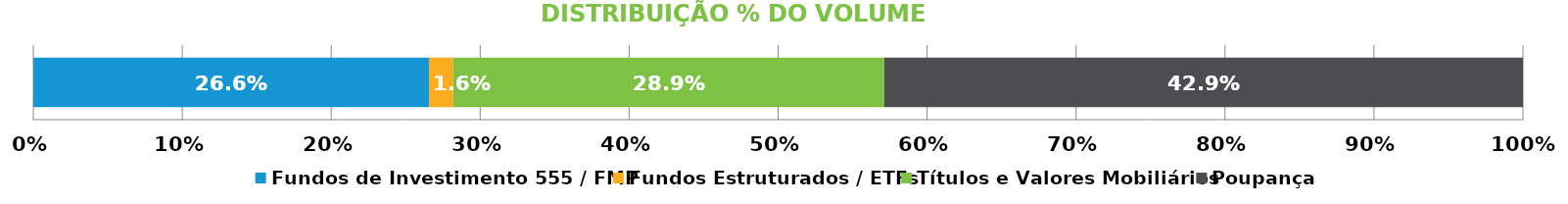
| Category | Fundos de Investimento 555 / FMP | Fundos Estruturados / ETFs | Títulos e Valores Mobiliários | Poupança |
|---|---|---|---|---|
| 0 | 0.266 | 0.016 | 0.289 | 0.429 |